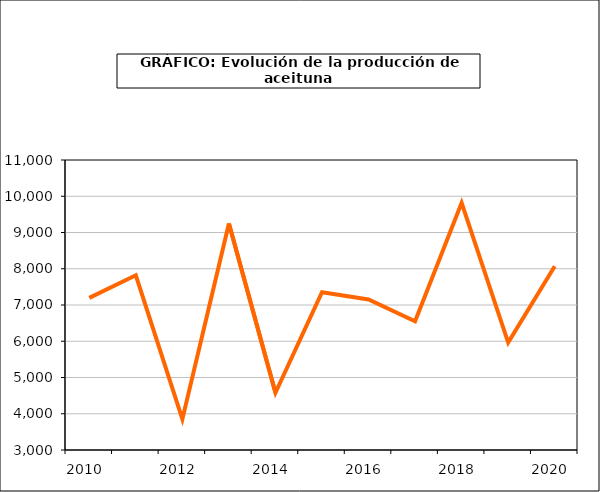
| Category | Series 0 |
|---|---|
| 2010.0 | 7197.6 |
| 2011.0 | 7820.06 |
| 2012.0 | 3849.263 |
| 2013.0 | 9250.61 |
| 2014.0 | 4579.208 |
| 2015.0 | 7352.095 |
| 2016.0 | 7154.076 |
| 2017.0 | 6549.499 |
| 2018.0 | 9819.569 |
| 2019.0 | 5965.077 |
| 2020.0 | 8069.983 |